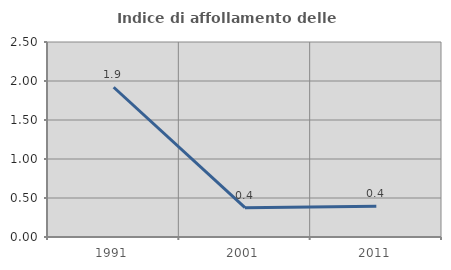
| Category | Indice di affollamento delle abitazioni  |
|---|---|
| 1991.0 | 1.92 |
| 2001.0 | 0.376 |
| 2011.0 | 0.393 |